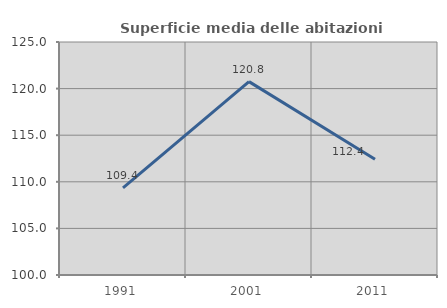
| Category | Superficie media delle abitazioni occupate |
|---|---|
| 1991.0 | 109.352 |
| 2001.0 | 120.751 |
| 2011.0 | 112.411 |